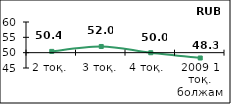
| Category | Диффузионный индекс* |
|---|---|
| 2 тоқ. | 50.42 |
| 3 тоқ. | 52.02 |
| 4 тоқ.  | 49.975 |
| 2009 1 тоқ. болжам | 48.265 |